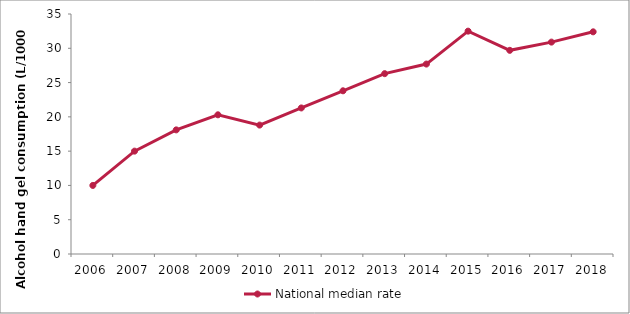
| Category | National median rate |
|---|---|
| 2006.0 | 10 |
| 2007.0 | 15 |
| 2008.0 | 18.1 |
| 2009.0 | 20.3 |
| 2010.0 | 18.8 |
| 2011.0 | 21.3 |
| 2012.0 | 23.8 |
| 2013.0 | 26.3 |
| 2014.0 | 27.7 |
| 2015.0 | 32.5 |
| 2016.0 | 29.7 |
| 2017.0 | 30.9 |
| 2018.0 | 32.4 |